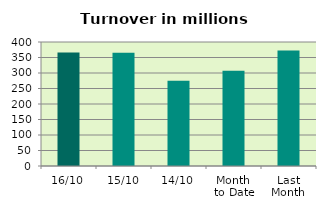
| Category | Series 0 |
|---|---|
| 16/10 | 366.453 |
| 15/10 | 365.056 |
| 14/10 | 274.613 |
| Month 
to Date | 307.576 |
| Last
Month | 372.713 |